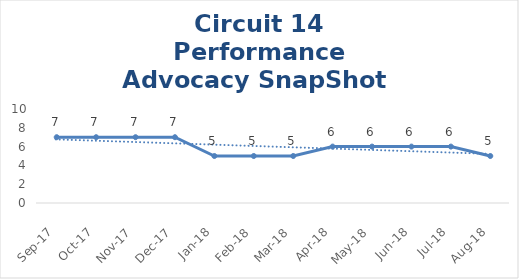
| Category | Circuit 14 |
|---|---|
| Sep-17 | 7 |
| Oct-17 | 7 |
| Nov-17 | 7 |
| Dec-17 | 7 |
| Jan-18 | 5 |
| Feb-18 | 5 |
| Mar-18 | 5 |
| Apr-18 | 6 |
| May-18 | 6 |
| Jun-18 | 6 |
| Jul-18 | 6 |
| Aug-18 | 5 |